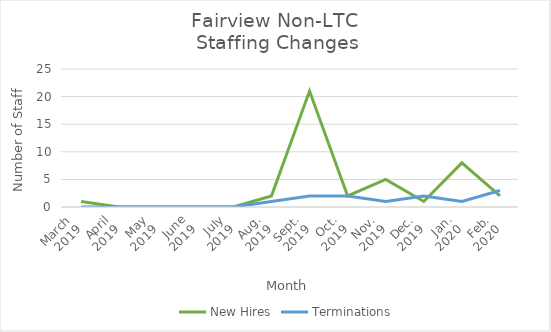
| Category | New Hires | Terminations |
|---|---|---|
| March
2019 | 1 | 0 |
| April
2019 | 0 | 0 |
| May
2019 | 0 | 0 |
| June
2019 | 0 | 0 |
| July
2019 | 0 | 0 |
| Aug.
2019 | 2 | 1 |
| Sept.
2019 | 21 | 2 |
| Oct.
2019 | 2 | 2 |
| Nov.
2019 | 5 | 1 |
| Dec.
2019 | 1 | 2 |
| Jan.
2020 | 8 | 1 |
| Feb.
2020 | 2 | 3 |